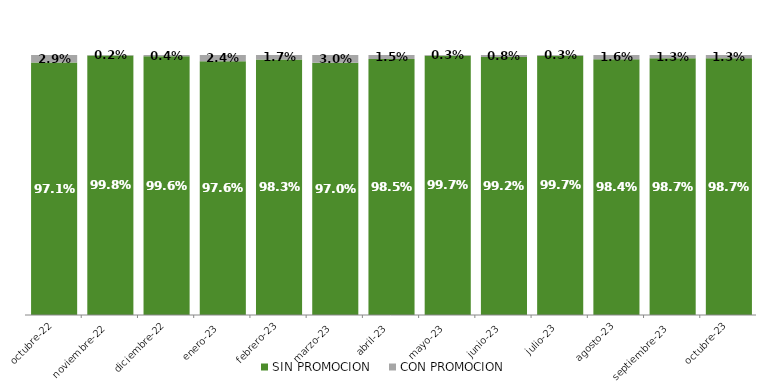
| Category | SIN PROMOCION   | CON PROMOCION   |
|---|---|---|
| 2022-10-01 | 0.971 | 0.029 |
| 2022-11-01 | 0.998 | 0.002 |
| 2022-12-01 | 0.996 | 0.004 |
| 2023-01-01 | 0.976 | 0.024 |
| 2023-02-01 | 0.983 | 0.017 |
| 2023-03-01 | 0.97 | 0.03 |
| 2023-04-01 | 0.985 | 0.015 |
| 2023-05-01 | 0.997 | 0.003 |
| 2023-06-01 | 0.992 | 0.008 |
| 2023-07-01 | 0.997 | 0.003 |
| 2023-08-01 | 0.984 | 0.016 |
| 2023-09-01 | 0.987 | 0.013 |
| 2023-10-01 | 0.987 | 0.013 |